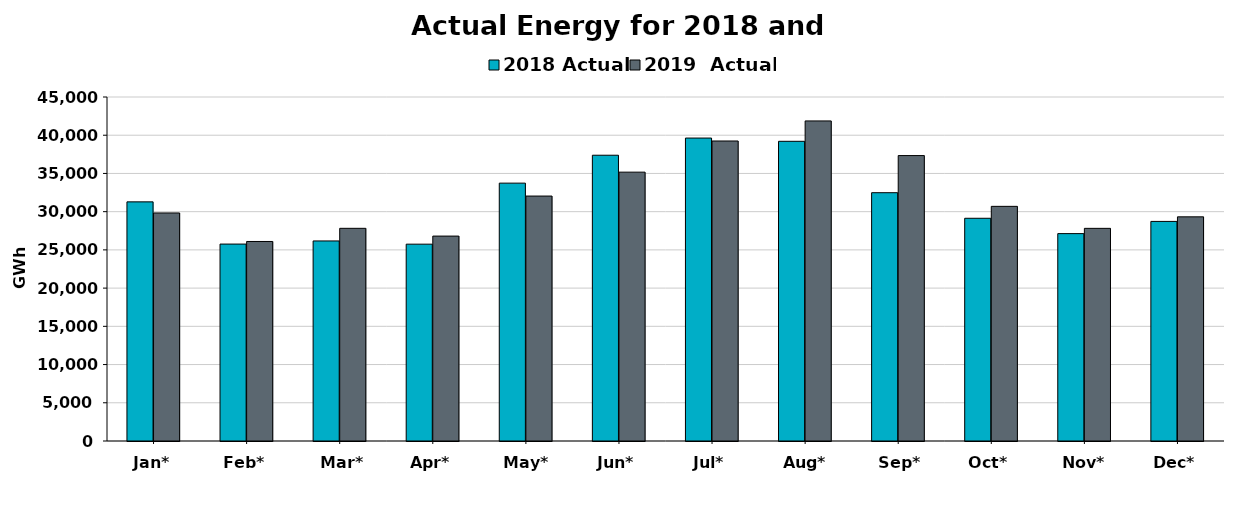
| Category | 2018 Actual | 2019  Actual |
|---|---|---|
| Jan* | 31282 | 29830 |
| Feb* | 25761 | 26100 |
| Mar* | 26170 | 27821 |
| Apr* | 25749 | 26805 |
| May* | 33733 | 32042 |
| Jun* | 37384 | 35170 |
| Jul* | 39629 | 39246 |
| Aug* | 39205 | 41870 |
| Sep* | 32481 | 37338 |
| Oct* | 29136 | 30695 |
| Nov* | 27128 | 27818 |
| Dec* | 28725 | 29323 |